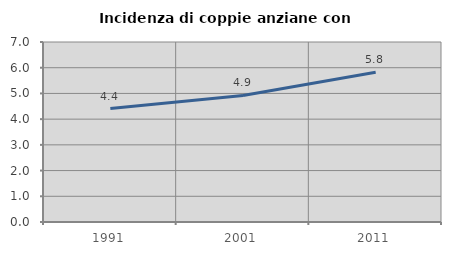
| Category | Incidenza di coppie anziane con figli |
|---|---|
| 1991.0 | 4.41 |
| 2001.0 | 4.921 |
| 2011.0 | 5.825 |